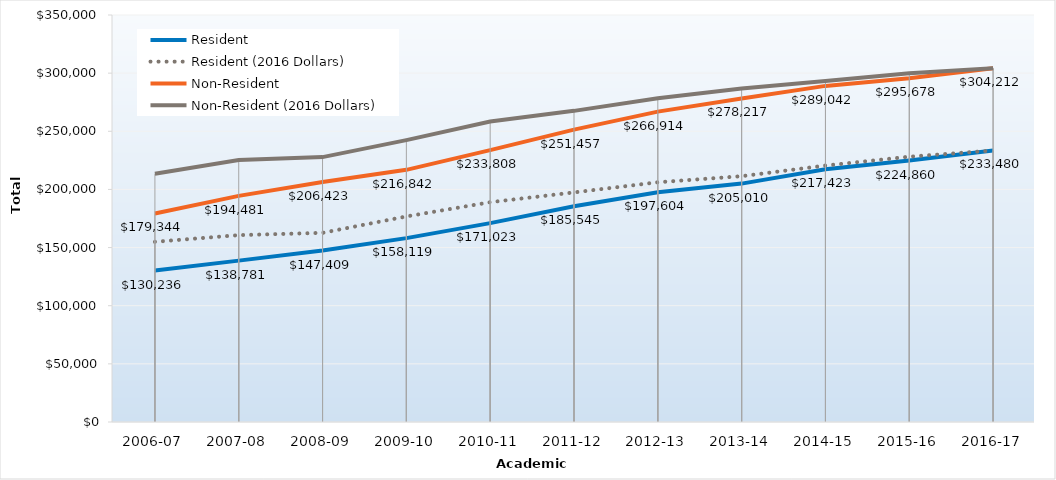
| Category | Resident | Resident (2016 Dollars) | Non-Resident | Non-Resident (2016 Dollars) |
|---|---|---|---|---|
| 2006-07 | 130236 | 154966.08 | 179344 | 213399.03 |
| 2007-08 | 138781 | 160706.12 | 194481 | 225205.81 |
| 2008-09 | 147409 | 162666.48 | 206423 | 227788.69 |
| 2009-10 | 158119 | 176758.49 | 216842 | 242403.91 |
| 2010-11 | 171023 | 189021.84 | 233808 | 258414.47 |
| 2011-12 | 185545 | 197434.69 | 251457 | 267570.31 |
| 2012-13 | 197604 | 206161.17 | 266914 | 278472.62 |
| 2013-14 | 205010 | 211383.15 | 278217 | 286865.94 |
| 2014-15 | 217423 | 220525.9 | 289042 | 293166.99 |
| 2015-16 | 224860.11 | 228151.46 | 295678.13 | 300006.09 |
| 2016-17 | 233479.65 | 233479.65 | 304212.15 | 304212.15 |